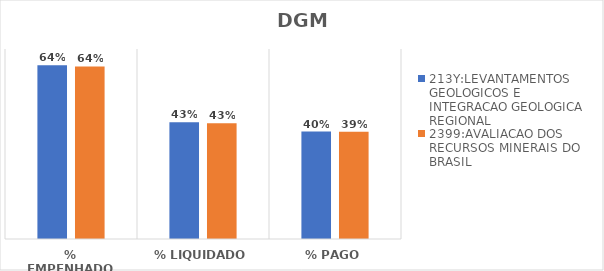
| Category | 213Y:LEVANTAMENTOS GEOLOGICOS E INTEGRACAO GEOLOGICA REGIONAL | 2399:AVALIACAO DOS RECURSOS MINERAIS DO BRASIL |
|---|---|---|
| % EMPENHADO | 0.64 | 0.636 |
| % LIQUIDADO | 0.43 | 0.426 |
| % PAGO | 0.396 | 0.395 |